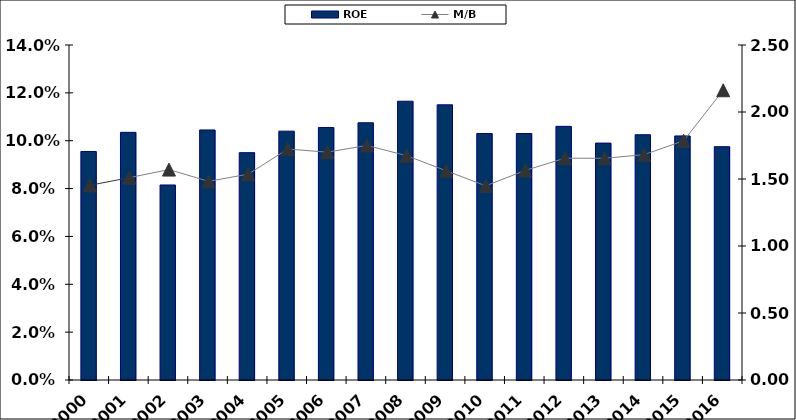
| Category | ROE |
|---|---|
| 2000.0 | 0.096 |
| 2001.0 | 0.104 |
| 2002.0 | 0.082 |
| 2003.0 | 0.105 |
| 2004.0 | 0.095 |
| 2005.0 | 0.104 |
| 2006.0 | 0.106 |
| 2007.0 | 0.108 |
| 2008.0 | 0.116 |
| 2009.0 | 0.115 |
| 2010.0 | 0.103 |
| 2011.0 | 0.103 |
| 2012.0 | 0.106 |
| 2013.0 | 0.099 |
| 2014.0 | 0.103 |
| 2015.0 | 0.102 |
| 2016.0 | 0.098 |